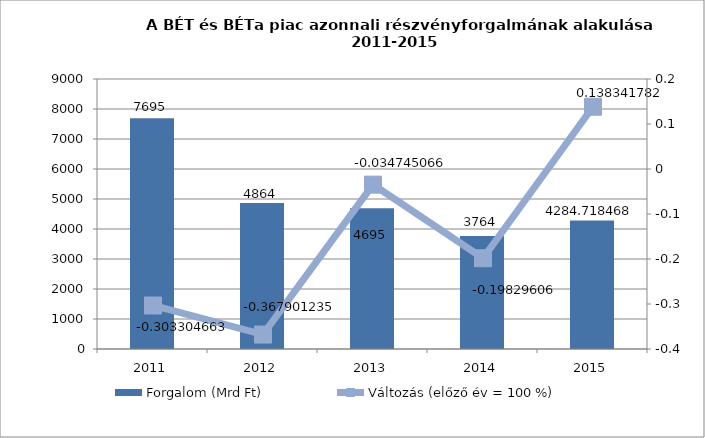
| Category | Forgalom (Mrd Ft) |
|---|---|
| 2011.0 | 7695 |
| 2012.0 | 4864 |
| 2013.0 | 4695 |
| 2014.0 | 3764 |
| 2015.0 | 4284.718 |